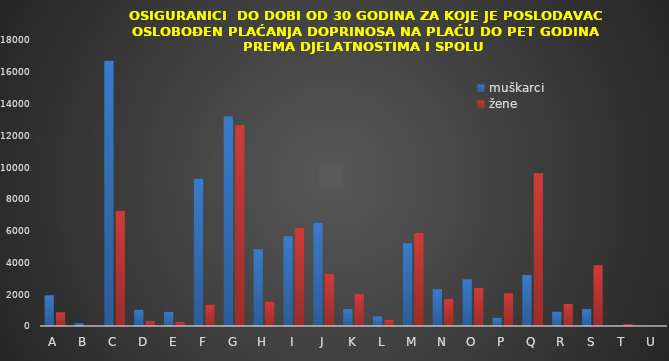
| Category | muškarci | žene |
|---|---|---|
| A | 1934 | 857 |
| B | 168 | 21 |
| C | 16700 | 7253 |
| D | 1022 | 305 |
| E | 896 | 271 |
| F | 9281 | 1332 |
| G | 13187 | 12635 |
| H | 4830 | 1537 |
| I | 5656 | 6198 |
| J | 6507 | 3286 |
| K | 1067 | 2007 |
| L | 600 | 402 |
| M | 5209 | 5848 |
| N | 2314 | 1711 |
| O | 2938 | 2390 |
| P | 519 | 2064 |
| Q | 3217 | 9606 |
| R | 909 | 1396 |
| S | 1062 | 3821 |
| T | 20 | 117 |
| U | 8 | 10 |